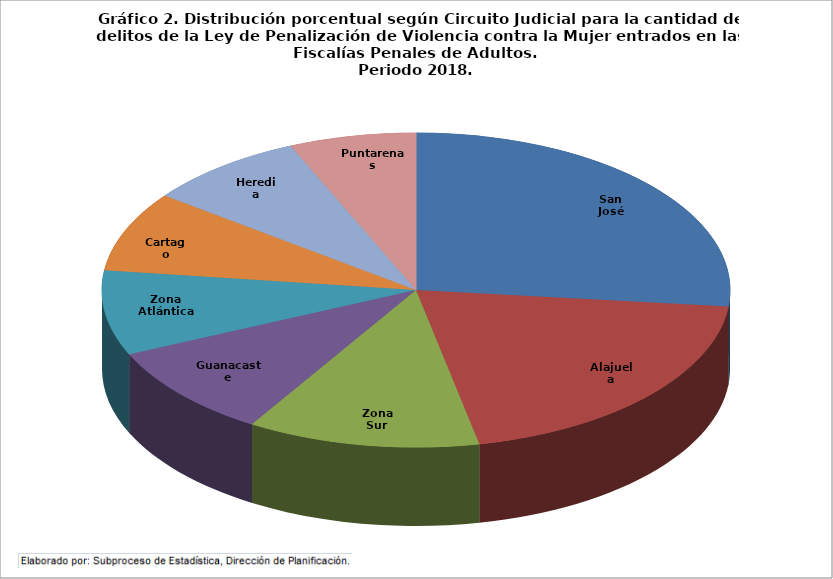
| Category | Entrada Neta |
|---|---|
| San José | 5371 |
| Alajuela | 4044 |
| Zona Sur | 2409 |
| Guanacaste | 1922 |
| Zona Atlántica | 1759 |
| Cartago | 1658 |
| Heredia | 1652 |
| Puntarenas | 1315 |